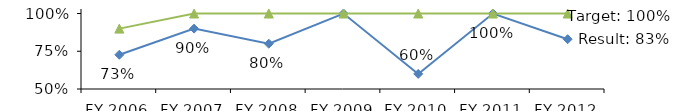
| Category | Result | Target |
|---|---|---|
| FY 2006 | 0.727 | 0.9 |
| FY 2007 | 0.9 | 1 |
| FY 2008 | 0.8 | 1 |
| FY 2009 | 1 | 1 |
| FY 2010 | 0.6 | 1 |
| FY 2011 | 1 | 1 |
| FY 2012 | 0.83 | 1 |